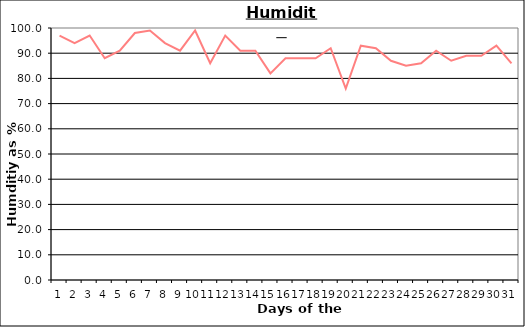
| Category | Series 0 |
|---|---|
| 0 | 97 |
| 1 | 94 |
| 2 | 97 |
| 3 | 88 |
| 4 | 91 |
| 5 | 98 |
| 6 | 99 |
| 7 | 94 |
| 8 | 91 |
| 9 | 99 |
| 10 | 86 |
| 11 | 97 |
| 12 | 91 |
| 13 | 91 |
| 14 | 82 |
| 15 | 88 |
| 16 | 88 |
| 17 | 88 |
| 18 | 92 |
| 19 | 76 |
| 20 | 93 |
| 21 | 92 |
| 22 | 87 |
| 23 | 85 |
| 24 | 86 |
| 25 | 91 |
| 26 | 87 |
| 27 | 89 |
| 28 | 89 |
| 29 | 93 |
| 30 | 86 |